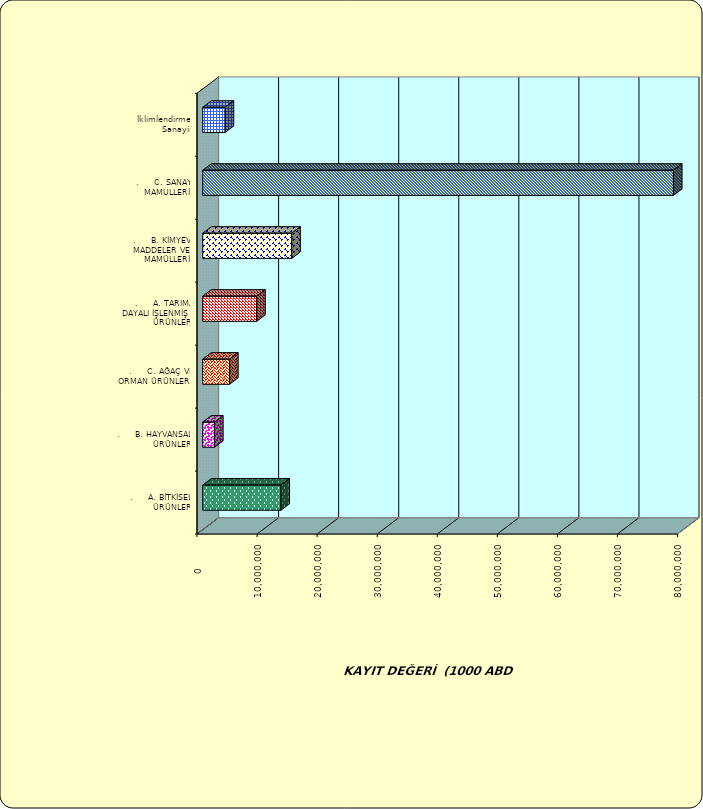
| Category | Series 0 |
|---|---|
| .     A. BİTKİSEL ÜRÜNLER | 13027758.796 |
| .     B. HAYVANSAL ÜRÜNLER | 1969508.617 |
| .     C. AĞAÇ VE ORMAN ÜRÜNLERİ | 4471051.549 |
| .     A. TARIMA DAYALI İŞLENMİŞ ÜRÜNLER | 8991180.35 |
| .     B. KİMYEVİ MADDELER VE MAMÜLLERİ | 14829933.673 |
| .     C. SANAYİ MAMULLERİ | 78382358.304 |
|  İklimlendirme Sanayii | 3737522.062 |